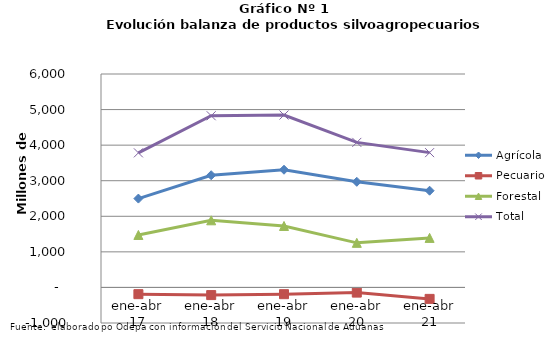
| Category | Agrícola | Pecuario | Forestal | Total |
|---|---|---|---|---|
| ene-abr 17 | 2497789 | -189455 | 1475069 | 3783403 |
| ene-abr 18 | 3154343 | -215195 | 1887085 | 4826233 |
| ene-abr 19 | 3308616 | -189652 | 1727868 | 4846832 |
| ene-abr 20 | 2969451 | -145488 | 1253477 | 4077440 |
| ene-abr 21 | 2718908 | -322207 | 1392655 | 3789356 |